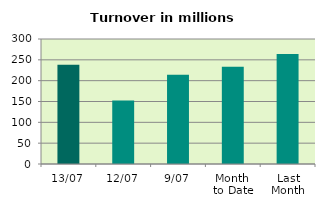
| Category | Series 0 |
|---|---|
| 13/07 | 238.02 |
| 12/07 | 152.587 |
| 9/07 | 214.355 |
| Month 
to Date | 233.556 |
| Last
Month | 264.074 |